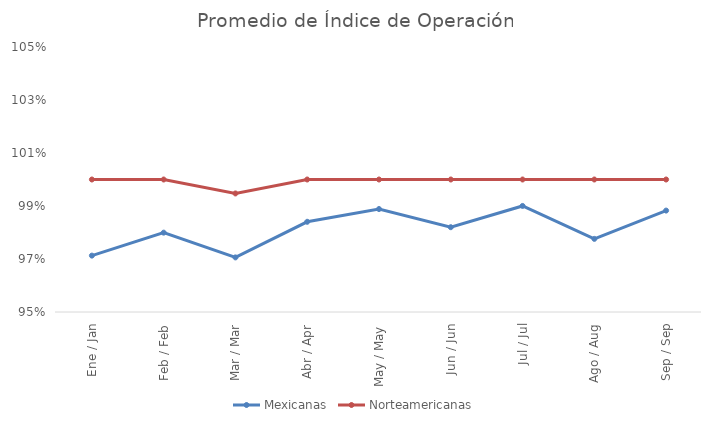
| Category | Mexicanas | Norteamericanas |
|---|---|---|
| Ene / Jan | 0.971 | 1 |
| Feb / Feb | 0.98 | 1 |
| Mar / Mar | 0.971 | 0.995 |
| Abr / Apr | 0.984 | 1 |
| May / May | 0.989 | 1 |
| Jun / Jun | 0.982 | 1 |
| Jul / Jul | 0.99 | 1 |
| Ago / Aug | 0.978 | 1 |
| Sep / Sep | 0.988 | 1 |